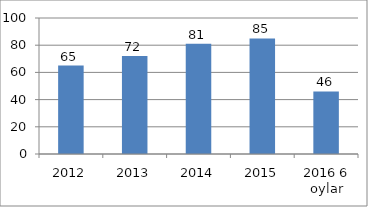
| Category | Series 0 |
|---|---|
| 2012 | 65 |
| 2013 | 72 |
| 2014 | 81 |
| 2015 | 85 |
| 2016 6 oylar | 46 |